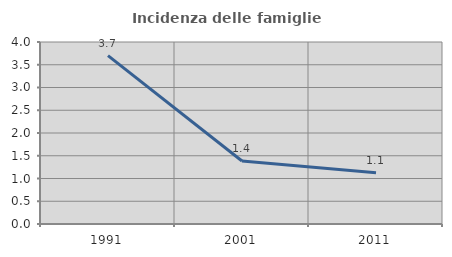
| Category | Incidenza delle famiglie numerose |
|---|---|
| 1991.0 | 3.699 |
| 2001.0 | 1.385 |
| 2011.0 | 1.124 |